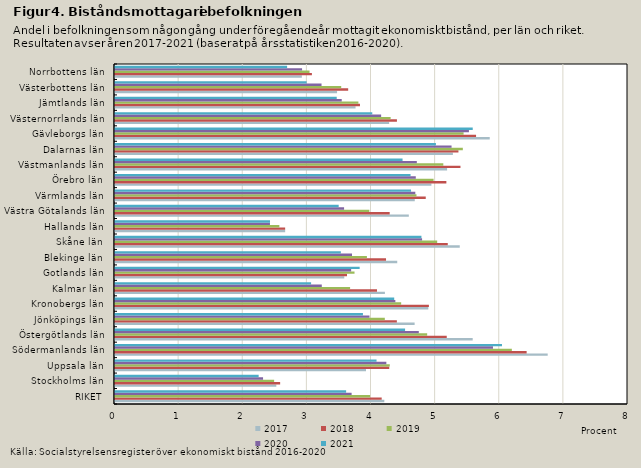
| Category | 2017 | 2018 | 2019 | 2020 | 2021 |
|---|---|---|---|---|---|
| RIKET | 4.2 | 4.159 | 3.978 | 3.69 | 3.604 |
| Stockholms län | 2.516 | 2.575 | 2.482 | 2.309 | 2.24 |
| Uppsala län | 3.914 | 4.277 | 4.285 | 4.232 | 4.079 |
| Södermanlands län | 6.748 | 6.419 | 6.189 | 5.894 | 6.035 |
| Östergötlands län | 5.578 | 5.173 | 4.868 | 4.738 | 4.524 |
| Jönköpings län | 4.673 | 4.395 | 4.208 | 3.968 | 3.866 |
| Kronobergs län | 4.886 | 4.895 | 4.463 | 4.372 | 4.354 |
| Kalmar län | 4.209 | 4.086 | 3.666 | 3.225 | 3.058 |
| Gotlands län | 3.576 | 3.618 | 3.735 | 3.683 | 3.815 |
| Blekinge län | 4.401 | 4.227 | 3.928 | 3.696 | 3.522 |
| Skåne län | 5.376 | 5.189 | 5.024 | 4.789 | 4.779 |
| Hallands län | 2.654 | 2.653 | 2.563 | 2.416 | 2.417 |
| Västra Götalands län | 4.582 | 4.284 | 3.966 | 3.572 | 3.488 |
| Värmlands län | 4.675 | 4.846 | 4.701 | 4.683 | 4.617 |
| Örebro län | 4.934 | 5.167 | 4.968 | 4.691 | 4.609 |
| Västmanlands län | 5.179 | 5.387 | 5.12 | 4.707 | 4.484 |
| Dalarnas län | 5.269 | 5.356 | 5.424 | 5.249 | 5.005 |
| Gävleborgs län | 5.844 | 5.631 | 5.436 | 5.519 | 5.579 |
| Västernorrlands län | 4.275 | 4.397 | 4.298 | 4.15 | 4.012 |
| Jämtlands län | 3.751 | 3.82 | 3.796 | 3.536 | 3.458 |
| Västerbottens län | 3.463 | 3.636 | 3.528 | 3.221 | 2.989 |
| Norrbottens län | 2.914 | 3.07 | 3.034 | 2.917 | 2.684 |